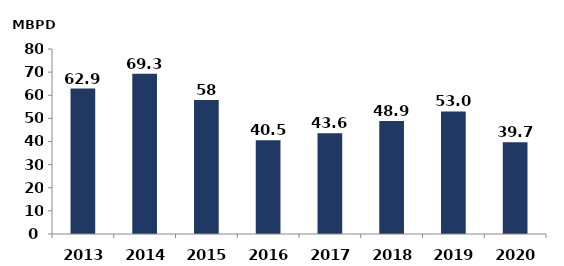
| Category | Series 0 |
|---|---|
| 2013.0 | 62.9 |
| 2014.0 | 69.3 |
| 2015.0 | 58 |
| 2016.0 | 40.5 |
| 2017.0 | 43.6 |
| 2018.0 | 48.9 |
| 2019.0 | 52.984 |
| 2020.0 | 39.677 |